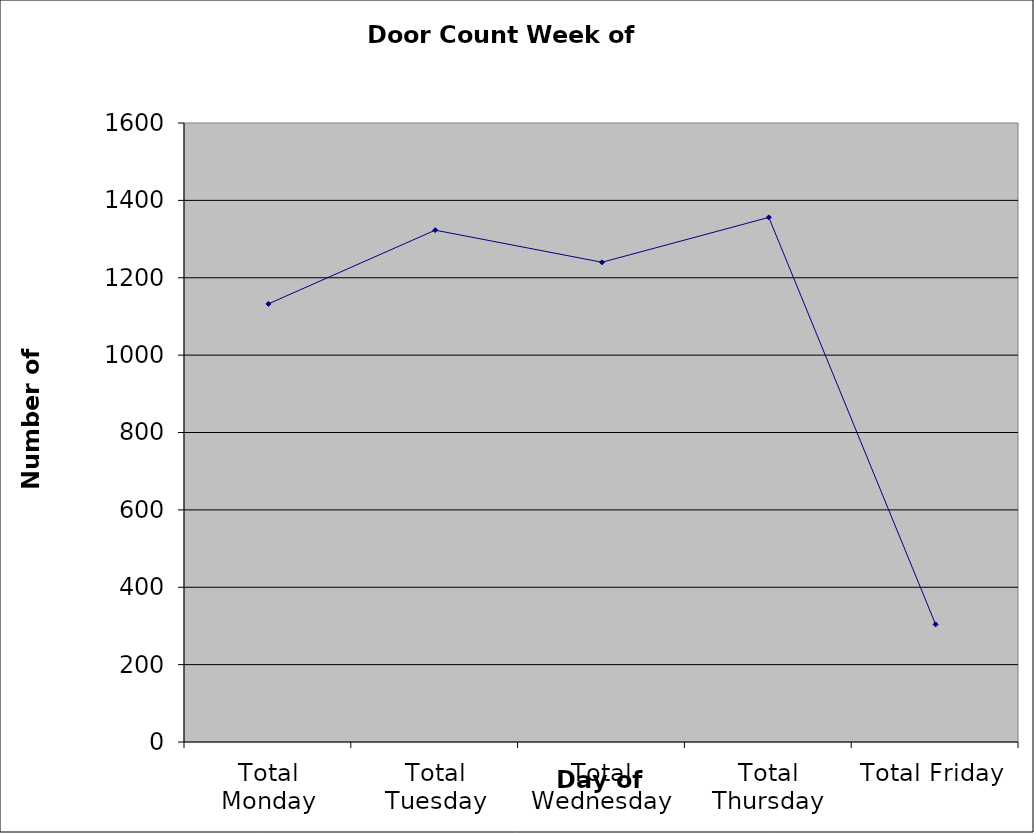
| Category | Series 0 |
|---|---|
| Total Monday | 1132.5 |
| Total Tuesday | 1323 |
| Total Wednesday | 1240 |
| Total Thursday | 1356 |
| Total Friday | 304 |